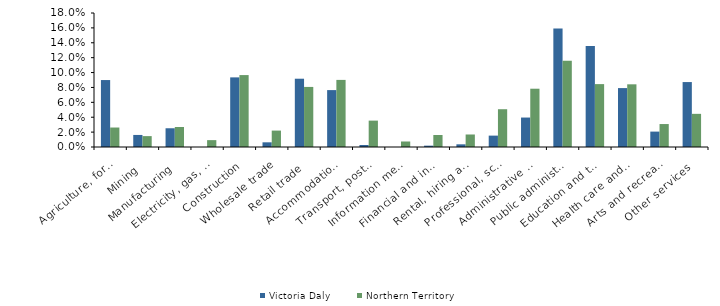
| Category | Victoria Daly | Northern Territory |
|---|---|---|
| Agriculture, forestry and fishing | 0.09 | 0.026 |
| Mining | 0.016 | 0.015 |
| Manufacturing | 0.025 | 0.027 |
| Electricity, gas, water and waste services | 0 | 0.009 |
| Construction | 0.094 | 0.097 |
| Wholesale trade | 0.006 | 0.022 |
| Retail trade | 0.092 | 0.081 |
| Accommodation and food services | 0.076 | 0.09 |
| Transport, postal and warehousing | 0.003 | 0.035 |
| Information media and telecommunications | 0 | 0.007 |
| Financial and insurance services | 0.002 | 0.016 |
| Rental, hiring and real estate services | 0.004 | 0.017 |
| Professional, scientific and technical services | 0.015 | 0.051 |
| Administrative and support services | 0.04 | 0.078 |
| Public administration and safety | 0.159 | 0.116 |
| Education and training | 0.136 | 0.084 |
| Health care and social assistance | 0.079 | 0.084 |
| Arts and recreation services | 0.021 | 0.031 |
| Other services | 0.087 | 0.045 |